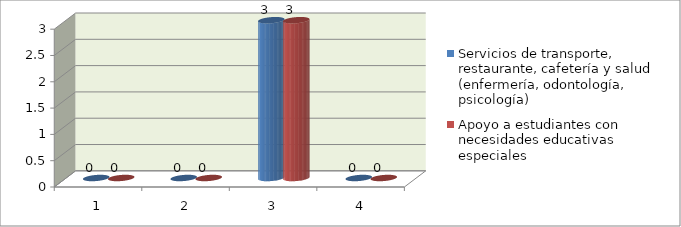
| Category | Servicios de transporte,
restaurante, cafetería y salud
(enfermería, odontología,
psicología) | Apoyo a estudiantes con
necesidades educativas
especiales |
|---|---|---|
| 0 | 0 | 0 |
| 1 | 0 | 0 |
| 2 | 3 | 3 |
| 3 | 0 | 0 |